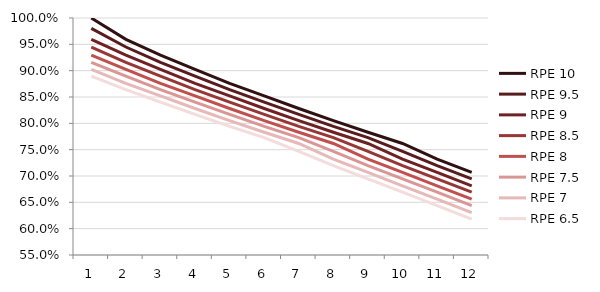
| Category | RPE 10 | RPE 9.5 | RPE 9 | RPE 8.5 | RPE 8 | RPE 7.5 | RPE 7 | RPE 6.5 |
|---|---|---|---|---|---|---|---|---|
| 0 | 1 | 0.98 | 0.959 | 0.945 | 0.93 | 0.916 | 0.902 | 0.889 |
| 1 | 0.959 | 0.945 | 0.93 | 0.916 | 0.902 | 0.889 | 0.876 | 0.864 |
| 2 | 0.93 | 0.916 | 0.902 | 0.889 | 0.876 | 0.864 | 0.852 | 0.84 |
| 3 | 0.902 | 0.889 | 0.876 | 0.864 | 0.852 | 0.84 | 0.828 | 0.817 |
| 4 | 0.876 | 0.864 | 0.852 | 0.84 | 0.828 | 0.817 | 0.805 | 0.794 |
| 5 | 0.852 | 0.84 | 0.828 | 0.817 | 0.805 | 0.794 | 0.783 | 0.773 |
| 6 | 0.828 | 0.817 | 0.805 | 0.794 | 0.783 | 0.773 | 0.762 | 0.747 |
| 7 | 0.805 | 0.794 | 0.783 | 0.773 | 0.762 | 0.747 | 0.732 | 0.72 |
| 8 | 0.783 | 0.773 | 0.762 | 0.747 | 0.732 | 0.72 | 0.707 | 0.695 |
| 9 | 0.762 | 0.747 | 0.732 | 0.72 | 0.707 | 0.695 | 0.681 | 0.669 |
| 10 | 0.732 | 0.72 | 0.707 | 0.695 | 0.681 | 0.669 | 0.656 | 0.644 |
| 11 | 0.707 | 0.695 | 0.681 | 0.669 | 0.656 | 0.644 | 0.63 | 0.618 |